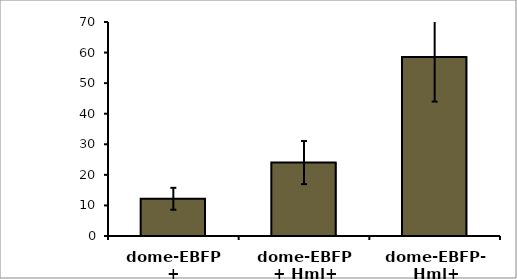
| Category | Series 0 |
|---|---|
| dome-EBFP+ | 12.176 |
| dome-EBFP+ Hml+ | 24.012 |
| dome-EBFP- Hml+ | 58.528 |